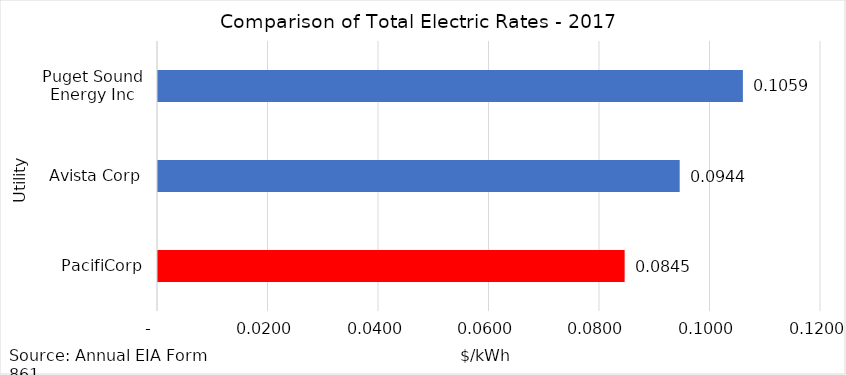
| Category | Series 0 |
|---|---|
| PacifiCorp | 0.084 |
| Avista Corp | 0.094 |
| Puget Sound Energy Inc | 0.106 |